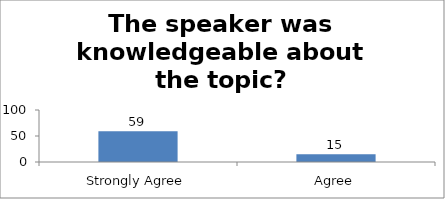
| Category | The speaker was knowledgeable about the topic? |
|---|---|
| Strongly Agree | 59 |
| Agree | 15 |